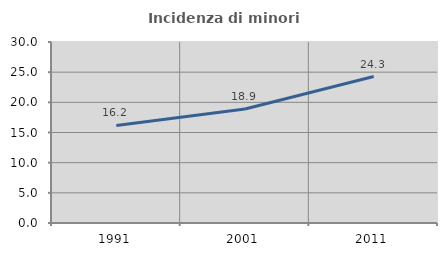
| Category | Incidenza di minori stranieri |
|---|---|
| 1991.0 | 16.162 |
| 2001.0 | 18.889 |
| 2011.0 | 24.273 |